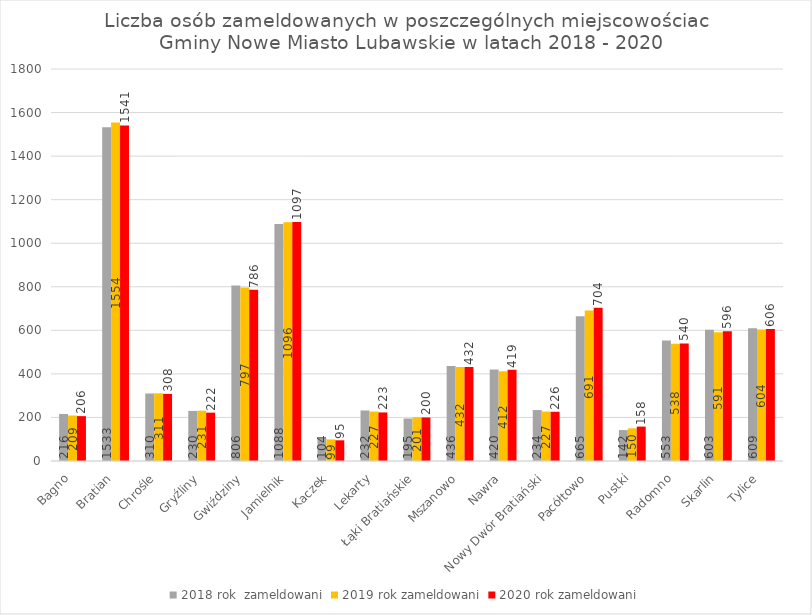
| Category | 2018 rok  | 2019 rok | 2020 rok |
|---|---|---|---|
| Bagno | 216 | 209 | 206 |
| Bratian | 1533 | 1554 | 1541 |
| Chrośle | 310 | 311 | 308 |
| Gryźliny | 230 | 231 | 222 |
| Gwiździny | 806 | 797 | 786 |
| Jamielnik | 1088 | 1096 | 1097 |
| Kaczek | 104 | 99 | 95 |
| Lekarty | 232 | 227 | 223 |
| Łąki Bratiańskie | 195 | 201 | 200 |
| Mszanowo | 436 | 432 | 432 |
| Nawra | 420 | 412 | 419 |
| Nowy Dwór Bratiański | 234 | 227 | 226 |
| Pacółtowo | 665 | 691 | 704 |
| Pustki | 142 | 150 | 158 |
| Radomno | 553 | 538 | 540 |
| Skarlin | 603 | 591 | 596 |
| Tylice | 609 | 604 | 606 |